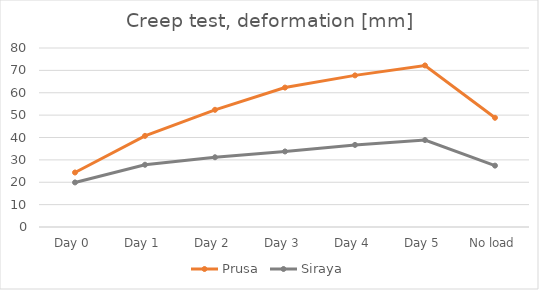
| Category | Prusa | Siraya |
|---|---|---|
| Day 0 | 24.36 | 19.92 |
| Day 1 | 40.73 | 27.82 |
| Day 2 | 52.38 | 31.17 |
| Day 3 | 62.31 | 33.76 |
| Day 4 | 67.76 | 36.69 |
| Day 5 | 72.2 | 38.86 |
| No load | 48.82 | 27.43 |